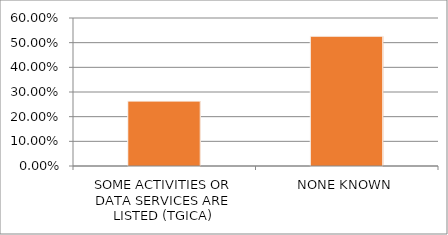
| Category | Series 0 |
|---|---|
| SOME ACTIVITIES OR DATA SERVICES ARE LISTED (TGICA) | 0.263 |
| NONE KNOWN | 0.526 |